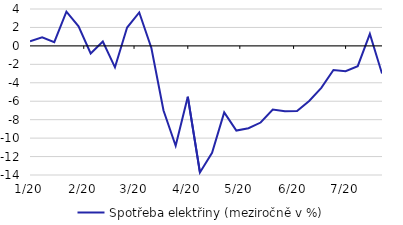
| Category | Spotřeba elektřiny (meziročně v %) |
|---|---|
| 2020-01-06 | 0.501 |
| 2020-01-13 | 0.923 |
| 2020-01-20 | 0.402 |
| 2020-01-27 | 3.708 |
| 2020-02-03 | 2.115 |
| 2020-02-10 | -0.824 |
| 2020-02-17 | 0.475 |
| 2020-02-24 | -2.326 |
| 2020-03-02 | 1.993 |
| 2020-03-09 | 3.623 |
| 2020-03-16 | -0.23 |
| 2020-03-23 | -7.013 |
| 2020-03-30 | -10.83 |
| 2020-04-06 | -5.515 |
| 2020-04-13 | -13.719 |
| 2020-04-20 | -11.589 |
| 2020-04-27 | -7.208 |
| 2020-05-04 | -9.181 |
| 2020-05-11 | -8.929 |
| 2020-05-18 | -8.312 |
| 2020-05-25 | -6.901 |
| 2020-06-01 | -7.098 |
| 2020-06-08 | -7.053 |
| 2020-06-15 | -5.97 |
| 2020-06-22 | -4.551 |
| 2020-06-29 | -2.61 |
| 2020-07-06 | -2.748 |
| 2020-07-13 | -2.2 |
| 2020-07-20 | 1.3 |
| 2020-07-27 | -3 |